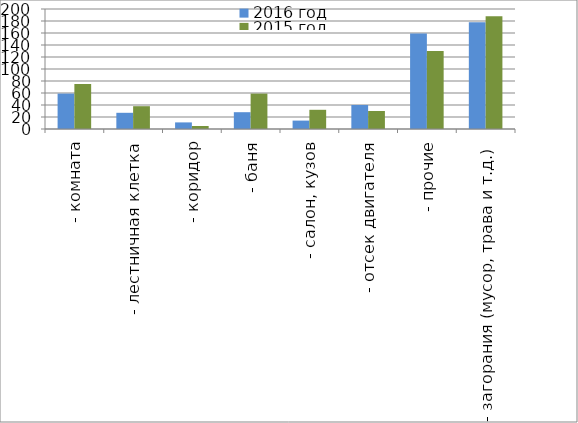
| Category | 2016 год | 2015 год |
|---|---|---|
|  - комната | 59 | 75 |
|  - лестничная клетка | 27 | 38 |
|  - коридор | 11 | 5 |
|  - баня | 28 | 59 |
|  - салон, кузов | 14 | 32 |
|  - отсек двигателя | 40 | 30 |
| - прочие | 159 | 130 |
| - загорания (мусор, трава и т.д.)  | 178 | 188 |